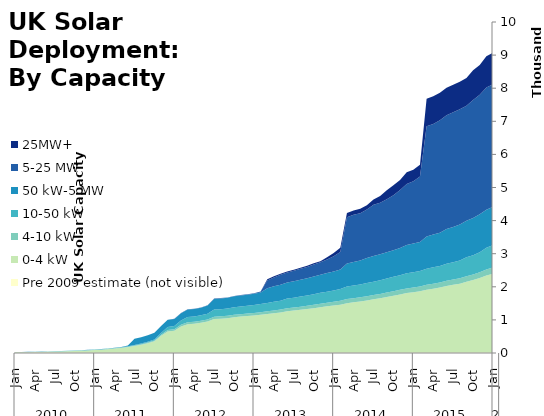
| Category | Pre 2009 estimate (not visible) | 0-4 kW | 4-10 kW | 10-50 kW | 50 kW-5 MW | 5-25 MW | 25MW+ |
|---|---|---|---|---|---|---|---|
| 0 | 14.6 | 7.769 | 4.828 | 2.553 | 1.277 | 0 | 0 |
| 1 | 14.6 | 8.87 | 5.013 | 2.649 | 1.277 | 0 | 0 |
| 2 | 14.6 | 10.74 | 5.299 | 3.054 | 1.277 | 0 | 0 |
| 3 | 14.6 | 12.973 | 5.472 | 3.299 | 1.277 | 0 | 0 |
| 4 | 14.6 | 16.445 | 5.762 | 3.677 | 1.444 | 0 | 0 |
| 5 | 14.6 | 20.711 | 6.093 | 3.88 | 2.244 | 0 | 0 |
| 6 | 14.6 | 25.934 | 6.443 | 4.075 | 2.395 | 0 | 0 |
| 7 | 14.6 | 31.157 | 6.739 | 4.352 | 2.395 | 0 | 0 |
| 8 | 14.6 | 37.926 | 7.034 | 4.819 | 2.395 | 0 | 0 |
| 9 | 14.6 | 46.14 | 7.442 | 5.213 | 2.842 | 0 | 0 |
| 10 | 14.6 | 55.676 | 7.901 | 5.767 | 2.894 | 0 | 0 |
| 11 | 14.6 | 62.948 | 8.205 | 6.052 | 3.071 | 0 | 0 |
| 12 | 14.6 | 72.887 | 8.875 | 6.623 | 3.071 | 0 | 0 |
| 13 | 14.6 | 84.347 | 9.524 | 7.38 | 3.595 | 0 | 0 |
| 14 | 14.6 | 101.514 | 10.511 | 8.226 | 4.412 | 0 | 0 |
| 15 | 14.6 | 117.889 | 11.499 | 9.192 | 5.345 | 0 | 0 |
| 16 | 14.6 | 137.533 | 12.622 | 10.382 | 7.093 | 0 | 0 |
| 17 | 14.6 | 163.385 | 13.894 | 11.8 | 19.684 | 0 | 0 |
| 18 | 14.6 | 193.888 | 15.39 | 15.077 | 189.368 | 0 | 0 |
| 19 | 14.6 | 233.537 | 17.293 | 18.31 | 189.368 | 0 | 0 |
| 20 | 14.6 | 283.601 | 19.155 | 22.547 | 195.735 | 0 | 0 |
| 21 | 14.6 | 342.361 | 21.336 | 26.946 | 209.627 | 0 | 0 |
| 22 | 14.6 | 507.652 | 30.463 | 48.796 | 210.71 | 0 | 0 |
| 23 | 14.6 | 633.492 | 44.456 | 95.975 | 216.286 | 0 | 0 |
| 24 | 14.6 | 656.086 | 45.194 | 97.091 | 216.445 | 6 | 0 |
| 25 | 14.6 | 782.49 | 53.296 | 135.127 | 217.629 | 6 | 0 |
| 26 | 14.6 | 853.61 | 58.025 | 161.323 | 227.507 | 6 | 0 |
| 27 | 14.6 | 868.19 | 58.406 | 162.981 | 228.403 | 6 | 0 |
| 28 | 14.6 | 898.039 | 59.645 | 167.401 | 228.996 | 6 | 0 |
| 29 | 14.6 | 936.524 | 61.539 | 176.661 | 244.411 | 11.5 | 0 |
| 30 | 14.6 | 1012.601 | 68.579 | 216.482 | 320.943 | 11.5 | 0 |
| 31 | 14.6 | 1023.053 | 69.351 | 217.965 | 323.621 | 11.5 | 0 |
| 32 | 14.6 | 1037.84 | 70.204 | 220.328 | 324.928 | 11.5 | 0 |
| 33 | 14.6 | 1068.956 | 72.625 | 228.922 | 327.759 | 11.5 | 0 |
| 34 | 14.6 | 1085.262 | 73.711 | 231.756 | 334.567 | 11.5 | 0 |
| 35 | 14.6 | 1102.13 | 75.116 | 234.659 | 336.097 | 11.5 | 0 |
| 36 | 14.6 | 1120.544 | 76.557 | 238.314 | 340.407 | 11.5 | 0 |
| 37 | 14.6 | 1139.969 | 78.327 | 244.123 | 351.324 | 30.726 | 0 |
| 38 | 14.6 | 1162.596 | 80.637 | 252.186 | 448.03 | 233.021 | 34.47 |
| 39 | 14.6 | 1186.572 | 82.699 | 262.393 | 472.91 | 264.383 | 34.47 |
| 40 | 14.6 | 1211.1 | 85.128 | 271.287 | 479.14 | 299.446 | 34.47 |
| 41 | 14.6 | 1247.164 | 89.397 | 294.542 | 484.283 | 299.446 | 34.47 |
| 42 | 14.6 | 1266.507 | 91.496 | 299.398 | 495.422 | 315.072 | 34.47 |
| 43 | 14.6 | 1289.251 | 94.377 | 307.126 | 509.429 | 327.88 | 34.47 |
| 44 | 14.6 | 1313.5 | 97.626 | 314.493 | 519.055 | 340.045 | 34.47 |
| 45 | 14.6 | 1339.852 | 100.732 | 320.906 | 534.321 | 365.428 | 34.47 |
| 46 | 14.6 | 1369.832 | 104.333 | 329.269 | 548.52 | 374.628 | 34.47 |
| 47 | 14.6 | 1394.81 | 107.505 | 336.965 | 562.773 | 409.705 | 66.06 |
| 48 | 14.6 | 1418.976 | 111.063 | 343.368 | 574.77 | 460.228 | 97.85 |
| 49 | 14.6 | 1445.173 | 118.617 | 353.876 | 593.009 | 526.427 | 129.551 |
| 50 | 14.6 | 1491.357 | 123.13 | 377.756 | 694.14 | 1401.265 | 129.551 |
| 51 | 14.6 | 1516.138 | 124.348 | 381.365 | 709.779 | 1426.97 | 129.551 |
| 52 | 14.6 | 1543.538 | 125.97 | 387.182 | 726.726 | 1426.97 | 129.551 |
| 53 | 14.6 | 1573.617 | 127.776 | 395.959 | 758.771 | 1462.563 | 129.551 |
| 54 | 14.6 | 1607.257 | 129.561 | 404.407 | 772.608 | 1547.848 | 162.001 |
| 55 | 14.6 | 1639.884 | 131.634 | 411.718 | 787.293 | 1553.922 | 202.688 |
| 56 | 14.6 | 1678.249 | 133.677 | 422.235 | 797.23 | 1597.542 | 276.495 |
| 57 | 14.6 | 1718.015 | 135.642 | 431.774 | 807.327 | 1657.957 | 305.386 |
| 58 | 14.6 | 1756.264 | 137.727 | 441.365 | 824.001 | 1746.977 | 305.386 |
| 59 | 14.6 | 1795.277 | 141.046 | 460.984 | 853.767 | 1842.038 | 351.276 |
| 60 | 14.6 | 1819.342 | 142.209 | 465.641 | 862.646 | 1881.012 | 351.276 |
| 61 | 14.6 | 1849.169 | 144 | 473.016 | 873.196 | 1978.317 | 351.276 |
| 62 | 14.6 | 1896.678 | 148.323 | 486.745 | 975.59 | 3329.03 | 832.845 |
| 63 | 14.6 | 1928.428 | 149.844 | 495.094 | 990.225 | 3343.749 | 832.845 |
| 64 | 14.6 | 1962.773 | 151.884 | 502.663 | 1001.727 | 3398.19 | 832.845 |
| 65 | 14.6 | 2011.976 | 155.636 | 515.841 | 1047.309 | 3435.551 | 832.845 |
| 66 | 14.6 | 2045.767 | 157.733 | 526.641 | 1062.878 | 3465.485 | 832.845 |
| 67 | 14.6 | 2080.655 | 160.149 | 539.509 | 1088.665 | 3477.045 | 832.845 |
| 68 | 14.6 | 2140.579 | 165.59 | 568.436 | 1106.025 | 3477.045 | 832.845 |
| 69 | 14.6 | 2189.678 | 168.259 | 580.687 | 1127.36 | 3565.908 | 899.043 |
| 70 | 14.6 | 2254.993 | 172.519 | 600.5 | 1146.449 | 3609.968 | 899.043 |
| 71 | 14.6 | 2327.408 | 181.546 | 653.612 | 1150.952 | 3689.647 | 946.977 |
| 72 | 14.6 | 2381.71 | 186.389 | 678.673 | 1150.952 | 3709.447 | 946.977 |